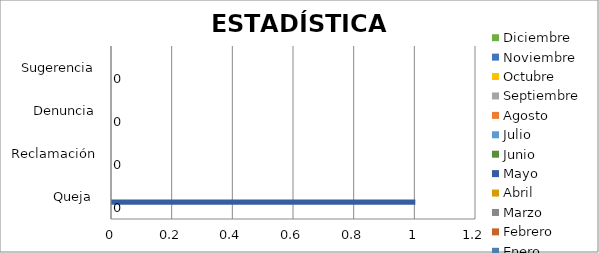
| Category | Enero | Febrero | Marzo | Abril | Mayo | Junio | Julio | Agosto | Septiembre | Octubre | Noviembre | Diciembre |
|---|---|---|---|---|---|---|---|---|---|---|---|---|
| Queja  | 0 | 0 | 0 | 0 | 1 | 0 | 0 | 0 | 0 | 0 | 0 | 0 |
| Reclamación | 0 | 0 | 0 | 0 | 0 | 0 | 0 | 0 | 0 | 0 | 0 | 0 |
| Denuncia | 0 | 0 | 0 | 0 | 0 | 0 | 0 | 0 | 0 | 0 | 0 | 0 |
| Sugerencia | 0 | 0 | 0 | 0 | 0 | 0 | 0 | 0 | 0 | 0 | 0 | 0 |